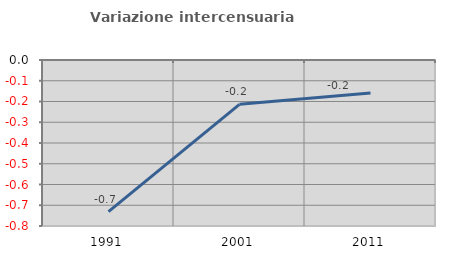
| Category | Variazione intercensuaria annua |
|---|---|
| 1991.0 | -0.73 |
| 2001.0 | -0.214 |
| 2011.0 | -0.159 |